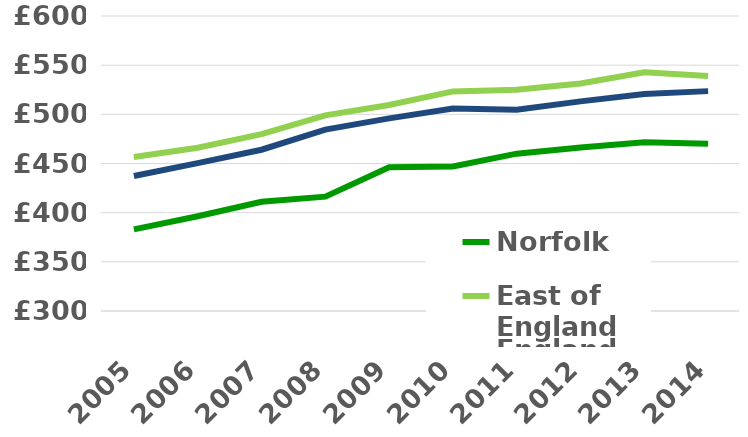
| Category | Norfolk | East of England | England |
|---|---|---|---|
| 2005.0 | 383 | 456.7 | 437.3 |
| 2006.0 | 396.3 | 466 | 450.4 |
| 2007.0 | 411.1 | 479.9 | 464 |
| 2008.0 | 416.3 | 499 | 484.5 |
| 2009.0 | 446.1 | 509.5 | 495.9 |
| 2010.0 | 447 | 523.3 | 506 |
| 2011.0 | 460 | 525 | 504.7 |
| 2012.0 | 466.2 | 531.4 | 513.2 |
| 2013.0 | 471.5 | 542.7 | 520.7 |
| 2014.0 | 470.2 | 539.1 | 523.6 |